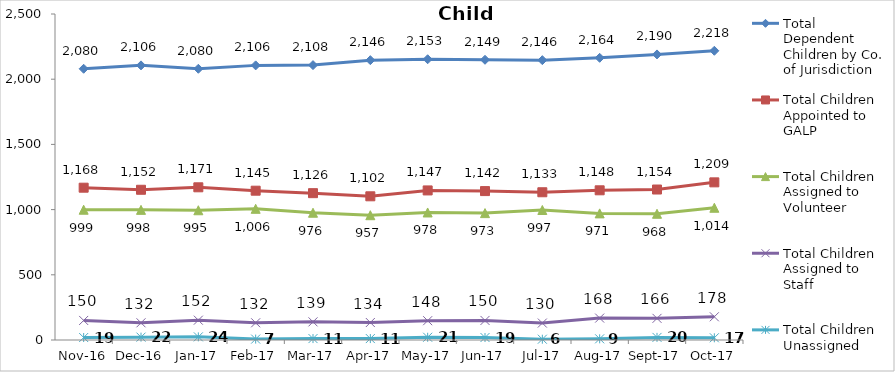
| Category | Total Dependent Children by Co. of Jurisdiction | Total Children Appointed to GALP | Total Children Assigned to Volunteer | Total Children Assigned to Staff | Total Children Unassigned |
|---|---|---|---|---|---|
| 2016-11-01 | 2080 | 1168 | 999 | 150 | 19 |
| 2016-12-01 | 2106 | 1152 | 998 | 132 | 22 |
| 2017-01-01 | 2080 | 1171 | 995 | 152 | 24 |
| 2017-02-01 | 2106 | 1145 | 1006 | 132 | 7 |
| 2017-03-01 | 2108 | 1126 | 976 | 139 | 11 |
| 2017-04-01 | 2146 | 1102 | 957 | 134 | 11 |
| 2017-05-01 | 2153 | 1147 | 978 | 148 | 21 |
| 2017-06-01 | 2149 | 1142 | 973 | 150 | 19 |
| 2017-07-01 | 2146 | 1133 | 997 | 130 | 6 |
| 2017-08-01 | 2164 | 1148 | 971 | 168 | 9 |
| 2017-09-01 | 2190 | 1154 | 968 | 166 | 20 |
| 2017-10-01 | 2218 | 1209 | 1014 | 178 | 17 |